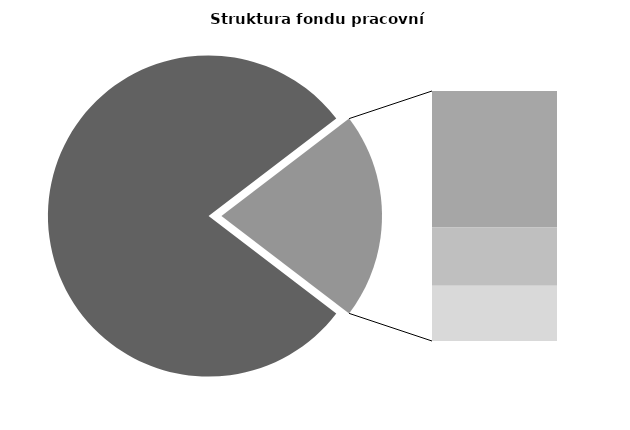
| Category | Series 0 |
|---|---|
| Průměrná měsíční odpracovaná doba bez přesčasu | 135.942 |
| Dovolená | 19.439 |
| Nemoc | 8.276 |
| Jiné | 7.856 |